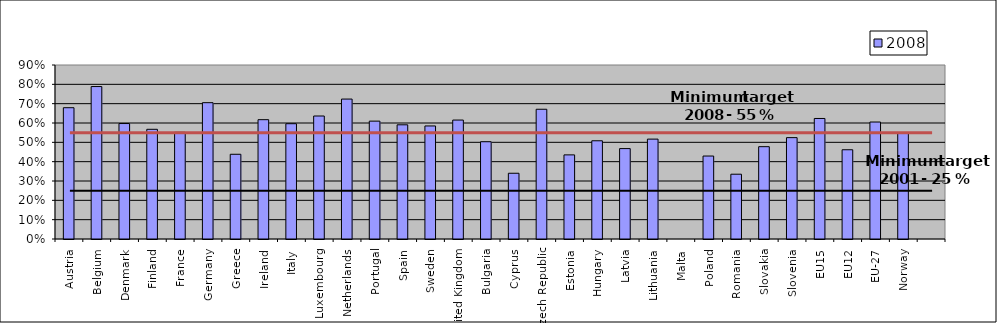
| Category | 2008 |
|---|---|
| Austria | 0.679 |
| Belgium | 0.789 |
| Denmark | 0.597 |
| Finland | 0.567 |
| France | 0.552 |
| Germany | 0.705 |
| Greece | 0.438 |
| Ireland | 0.617 |
| Italy | 0.596 |
| Luxembourg | 0.636 |
| Netherlands | 0.724 |
| Portugal | 0.61 |
| Spain | 0.591 |
| Sweden | 0.585 |
| United Kingdom | 0.615 |
| Bulgaria | 0.503 |
| Cyprus | 0.34 |
| Czech Republic | 0.671 |
| Estonia | 0.435 |
| Hungary | 0.508 |
| Latvia | 0.468 |
| Lithuania | 0.517 |
| Malta | 0 |
| Poland | 0.429 |
| Romania | 0.335 |
| Slovakia | 0.477 |
| Slovenia | 0.524 |
| EU15 | 0.623 |
| EU12 | 0.462 |
| EU-27 | 0.605 |
| Norway | 0.547 |